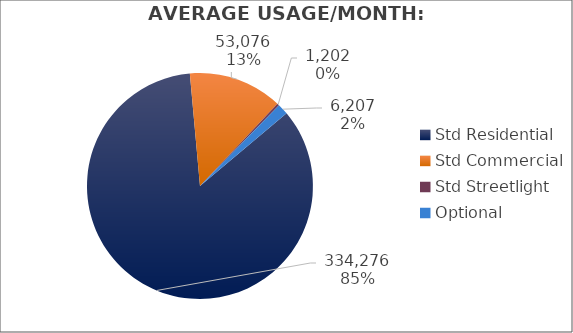
| Category | Usage |
|---|---|
| Std Residential | 334276 |
| Std Commercial | 53075.667 |
| Std Streetlight | 1202 |
| Optional | 6207 |